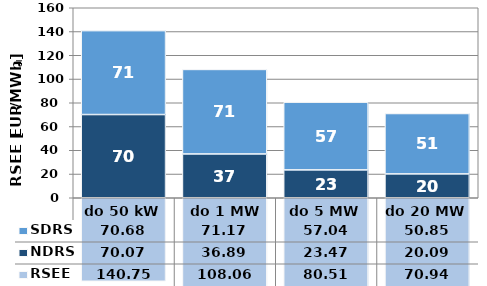
| Category | NDRS | SDRS |
|---|---|---|
| do 50 kW | 70.07 | 70.68 |
|  do 1 MW | 36.89 | 71.17 |
| do 5 MW | 23.47 | 57.04 |
| do 20 MW | 20.09 | 50.85 |